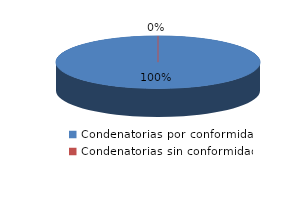
| Category | Series 0 |
|---|---|
| 0 | 45 |
| 1 | 0 |